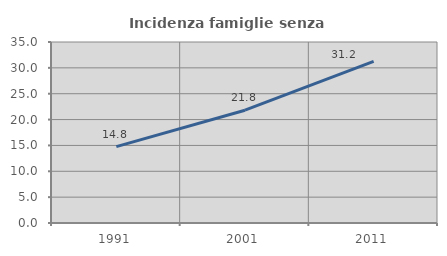
| Category | Incidenza famiglie senza nuclei |
|---|---|
| 1991.0 | 14.768 |
| 2001.0 | 21.808 |
| 2011.0 | 31.237 |